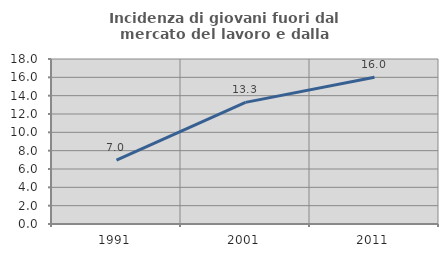
| Category | Incidenza di giovani fuori dal mercato del lavoro e dalla formazione  |
|---|---|
| 1991.0 | 6.964 |
| 2001.0 | 13.265 |
| 2011.0 | 16 |